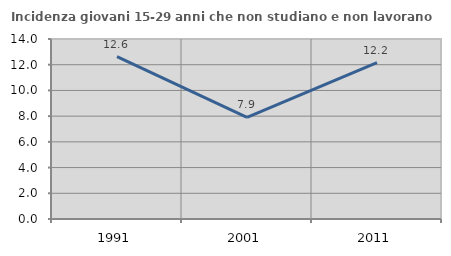
| Category | Incidenza giovani 15-29 anni che non studiano e non lavorano  |
|---|---|
| 1991.0 | 12.632 |
| 2001.0 | 7.901 |
| 2011.0 | 12.159 |